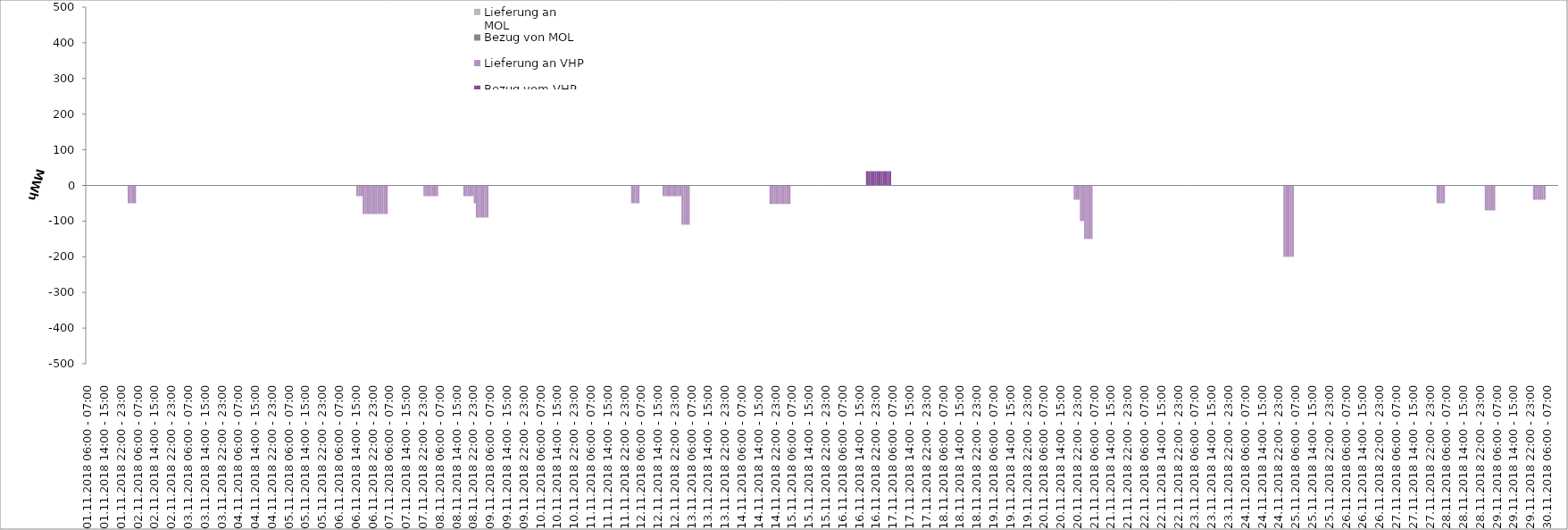
| Category | Bezug vom VHP | Lieferung an VHP | Bezug von MOL | Lieferung an MOL |
|---|---|---|---|---|
| 01.11.2018 06:00 - 07:00 | 0 | 0 | 0 | 0 |
| 01.11.2018 07:00 - 08:00 | 0 | 0 | 0 | 0 |
| 01.11.2018 08:00 - 09:00 | 0 | 0 | 0 | 0 |
| 01.11.2018 09:00 - 10:00 | 0 | 0 | 0 | 0 |
| 01.11.2018 10:00 - 11:00 | 0 | 0 | 0 | 0 |
| 01.11.2018 11:00 - 12:00 | 0 | 0 | 0 | 0 |
| 01.11.2018 12:00 - 13:00 | 0 | 0 | 0 | 0 |
| 01.11.2018 13:00 - 14:00 | 0 | 0 | 0 | 0 |
| 01.11.2018 14:00 - 15:00 | 0 | 0 | 0 | 0 |
| 01.11.2018 15:00 - 16:00 | 0 | 0 | 0 | 0 |
| 01.11.2018 16:00 - 17:00 | 0 | 0 | 0 | 0 |
| 01.11.2018 17:00 - 18:00 | 0 | 0 | 0 | 0 |
| 01.11.2018 18:00 - 19:00 | 0 | 0 | 0 | 0 |
| 01.11.2018 19:00 - 20:00 | 0 | 0 | 0 | 0 |
| 01.11.2018 20:00 - 21:00 | 0 | 0 | 0 | 0 |
| 01.11.2018 21:00 - 22:00 | 0 | 0 | 0 | 0 |
| 01.11.2018 22:00 - 23:00 | 0 | 0 | 0 | 0 |
| 01.11.2018 23:00 - 24:00 | 0 | 0 | 0 | 0 |
| 02.11.2018 00:00 - 01:00 | 0 | 0 | 0 | 0 |
| 02.11.2018 01:00 - 02:00 | 0 | 0 | 0 | 0 |
| 02.11.2018 02:00 - 03:00 | 0 | -50 | 0 | 0 |
| 02.11.2018 03:00 - 04:00 | 0 | -50 | 0 | 0 |
| 02.11.2018 04:00 - 05:00 | 0 | -50 | 0 | 0 |
| 02.11.2018 05:00 - 06:00 | 0 | -50 | 0 | 0 |
| 02.11.2018 06:00 - 07:00 | 0 | 0 | 0 | 0 |
| 02.11.2018 07:00 - 08:00 | 0 | 0 | 0 | 0 |
| 02.11.2018 08:00 - 09:00 | 0 | 0 | 0 | 0 |
| 02.11.2018 09:00 - 10:00 | 0 | 0 | 0 | 0 |
| 02.11.2018 10:00 - 11:00 | 0 | 0 | 0 | 0 |
| 02.11.2018 11:00 - 12:00 | 0 | 0 | 0 | 0 |
| 02.11.2018 12:00 - 13:00 | 0 | 0 | 0 | 0 |
| 02.11.2018 13:00 - 14:00 | 0 | 0 | 0 | 0 |
| 02.11.2018 14:00 - 15:00 | 0 | 0 | 0 | 0 |
| 02.11.2018 15:00 - 16:00 | 0 | 0 | 0 | 0 |
| 02.11.2018 16:00 - 17:00 | 0 | 0 | 0 | 0 |
| 02.11.2018 17:00 - 18:00 | 0 | 0 | 0 | 0 |
| 02.11.2018 18:00 - 19:00 | 0 | 0 | 0 | 0 |
| 02.11.2018 19:00 - 20:00 | 0 | 0 | 0 | 0 |
| 02.11.2018 20:00 - 21:00 | 0 | 0 | 0 | 0 |
| 02.11.2018 21:00 - 22:00 | 0 | 0 | 0 | 0 |
| 02.11.2018 22:00 - 23:00 | 0 | 0 | 0 | 0 |
| 02.11.2018 23:00 - 24:00 | 0 | 0 | 0 | 0 |
| 03.11.2018 00:00 - 01:00 | 0 | 0 | 0 | 0 |
| 03.11.2018 01:00 - 02:00 | 0 | 0 | 0 | 0 |
| 03.11.2018 02:00 - 03:00 | 0 | 0 | 0 | 0 |
| 03.11.2018 03:00 - 04:00 | 0 | 0 | 0 | 0 |
| 03.11.2018 04:00 - 05:00 | 0 | 0 | 0 | 0 |
| 03.11.2018 05:00 - 06:00 | 0 | 0 | 0 | 0 |
| 03.11.2018 06:00 - 07:00 | 0 | 0 | 0 | 0 |
| 03.11.2018 07:00 - 08:00 | 0 | 0 | 0 | 0 |
| 03.11.2018 08:00 - 09:00 | 0 | 0 | 0 | 0 |
| 03.11.2018 09:00 - 10:00 | 0 | 0 | 0 | 0 |
| 03.11.2018 10:00 - 11:00 | 0 | 0 | 0 | 0 |
| 03.11.2018 11:00 - 12:00 | 0 | 0 | 0 | 0 |
| 03.11.2018 12:00 - 13:00 | 0 | 0 | 0 | 0 |
| 03.11.2018 13:00 - 14:00 | 0 | 0 | 0 | 0 |
| 03.11.2018 14:00 - 15:00 | 0 | 0 | 0 | 0 |
| 03.11.2018 15:00 - 16:00 | 0 | 0 | 0 | 0 |
| 03.11.2018 16:00 - 17:00 | 0 | 0 | 0 | 0 |
| 03.11.2018 17:00 - 18:00 | 0 | 0 | 0 | 0 |
| 03.11.2018 18:00 - 19:00 | 0 | 0 | 0 | 0 |
| 03.11.2018 19:00 - 20:00 | 0 | 0 | 0 | 0 |
| 03.11.2018 20:00 - 21:00 | 0 | 0 | 0 | 0 |
| 03.11.2018 21:00 - 22:00 | 0 | 0 | 0 | 0 |
| 03.11.2018 22:00 - 23:00 | 0 | 0 | 0 | 0 |
| 03.11.2018 23:00 - 24:00 | 0 | 0 | 0 | 0 |
| 04.11.2018 00:00 - 01:00 | 0 | 0 | 0 | 0 |
| 04.11.2018 01:00 - 02:00 | 0 | 0 | 0 | 0 |
| 04.11.2018 02:00 - 03:00 | 0 | 0 | 0 | 0 |
| 04.11.2018 03:00 - 04:00 | 0 | 0 | 0 | 0 |
| 04.11.2018 04:00 - 05:00 | 0 | 0 | 0 | 0 |
| 04.11.2018 05:00 - 06:00 | 0 | 0 | 0 | 0 |
| 04.11.2018 06:00 - 07:00 | 0 | 0 | 0 | 0 |
| 04.11.2018 07:00 - 08:00 | 0 | 0 | 0 | 0 |
| 04.11.2018 08:00 - 09:00 | 0 | 0 | 0 | 0 |
| 04.11.2018 09:00 - 10:00 | 0 | 0 | 0 | 0 |
| 04.11.2018 10:00 - 11:00 | 0 | 0 | 0 | 0 |
| 04.11.2018 11:00 - 12:00 | 0 | 0 | 0 | 0 |
| 04.11.2018 12:00 - 13:00 | 0 | 0 | 0 | 0 |
| 04.11.2018 13:00 - 14:00 | 0 | 0 | 0 | 0 |
| 04.11.2018 14:00 - 15:00 | 0 | 0 | 0 | 0 |
| 04.11.2018 15:00 - 16:00 | 0 | 0 | 0 | 0 |
| 04.11.2018 16:00 - 17:00 | 0 | 0 | 0 | 0 |
| 04.11.2018 17:00 - 18:00 | 0 | 0 | 0 | 0 |
| 04.11.2018 18:00 - 19:00 | 0 | 0 | 0 | 0 |
| 04.11.2018 19:00 - 20:00 | 0 | 0 | 0 | 0 |
| 04.11.2018 20:00 - 21:00 | 0 | 0 | 0 | 0 |
| 04.11.2018 21:00 - 22:00 | 0 | 0 | 0 | 0 |
| 04.11.2018 22:00 - 23:00 | 0 | 0 | 0 | 0 |
| 04.11.2018 23:00 - 24:00 | 0 | 0 | 0 | 0 |
| 05.11.2018 00:00 - 01:00 | 0 | 0 | 0 | 0 |
| 05.11.2018 01:00 - 02:00 | 0 | 0 | 0 | 0 |
| 05.11.2018 02:00 - 03:00 | 0 | 0 | 0 | 0 |
| 05.11.2018 03:00 - 04:00 | 0 | 0 | 0 | 0 |
| 05.11.2018 04:00 - 05:00 | 0 | 0 | 0 | 0 |
| 05.11.2018 05:00 - 06:00 | 0 | 0 | 0 | 0 |
| 05.11.2018 06:00 - 07:00 | 0 | 0 | 0 | 0 |
| 05.11.2018 07:00 - 08:00 | 0 | 0 | 0 | 0 |
| 05.11.2018 08:00 - 09:00 | 0 | 0 | 0 | 0 |
| 05.11.2018 09:00 - 10:00 | 0 | 0 | 0 | 0 |
| 05.11.2018 10:00 - 11:00 | 0 | 0 | 0 | 0 |
| 05.11.2018 11:00 - 12:00 | 0 | 0 | 0 | 0 |
| 05.11.2018 12:00 - 13:00 | 0 | 0 | 0 | 0 |
| 05.11.2018 13:00 - 14:00 | 0 | 0 | 0 | 0 |
| 05.11.2018 14:00 - 15:00 | 0 | 0 | 0 | 0 |
| 05.11.2018 15:00 - 16:00 | 0 | 0 | 0 | 0 |
| 05.11.2018 16:00 - 17:00 | 0 | 0 | 0 | 0 |
| 05.11.2018 17:00 - 18:00 | 0 | 0 | 0 | 0 |
| 05.11.2018 18:00 - 19:00 | 0 | 0 | 0 | 0 |
| 05.11.2018 19:00 - 20:00 | 0 | 0 | 0 | 0 |
| 05.11.2018 20:00 - 21:00 | 0 | 0 | 0 | 0 |
| 05.11.2018 21:00 - 22:00 | 0 | 0 | 0 | 0 |
| 05.11.2018 22:00 - 23:00 | 0 | 0 | 0 | 0 |
| 05.11.2018 23:00 - 24:00 | 0 | 0 | 0 | 0 |
| 06.11.2018 00:00 - 01:00 | 0 | 0 | 0 | 0 |
| 06.11.2018 01:00 - 02:00 | 0 | 0 | 0 | 0 |
| 06.11.2018 02:00 - 03:00 | 0 | 0 | 0 | 0 |
| 06.11.2018 03:00 - 04:00 | 0 | 0 | 0 | 0 |
| 06.11.2018 04:00 - 05:00 | 0 | 0 | 0 | 0 |
| 06.11.2018 05:00 - 06:00 | 0 | 0 | 0 | 0 |
| 06.11.2018 06:00 - 07:00 | 0 | 0 | 0 | 0 |
| 06.11.2018 07:00 - 08:00 | 0 | 0 | 0 | 0 |
| 06.11.2018 08:00 - 09:00 | 0 | 0 | 0 | 0 |
| 06.11.2018 09:00 - 10:00 | 0 | 0 | 0 | 0 |
| 06.11.2018 10:00 - 11:00 | 0 | 0 | 0 | 0 |
| 06.11.2018 11:00 - 12:00 | 0 | 0 | 0 | 0 |
| 06.11.2018 12:00 - 13:00 | 0 | 0 | 0 | 0 |
| 06.11.2018 13:00 - 14:00 | 0 | 0 | 0 | 0 |
| 06.11.2018 14:00 - 15:00 | 0 | 0 | 0 | 0 |
| 06.11.2018 15:00 - 16:00 | 0 | -30 | 0 | 0 |
| 06.11.2018 16:00 - 17:00 | 0 | -30 | 0 | 0 |
| 06.11.2018 17:00 - 18:00 | 0 | -30 | 0 | 0 |
| 06.11.2018 18:00 - 19:00 | 0 | -80 | 0 | 0 |
| 06.11.2018 19:00 - 20:00 | 0 | -80 | 0 | 0 |
| 06.11.2018 20:00 - 21:00 | 0 | -80 | 0 | 0 |
| 06.11.2018 21:00 - 22:00 | 0 | -80 | 0 | 0 |
| 06.11.2018 22:00 - 23:00 | 0 | -80 | 0 | 0 |
| 06.11.2018 23:00 - 24:00 | 0 | -80 | 0 | 0 |
| 07.11.2018 00:00 - 01:00 | 0 | -80 | 0 | 0 |
| 07.11.2018 01:00 - 02:00 | 0 | -80 | 0 | 0 |
| 07.11.2018 02:00 - 03:00 | 0 | -80 | 0 | 0 |
| 07.11.2018 03:00 - 04:00 | 0 | -80 | 0 | 0 |
| 07.11.2018 04:00 - 05:00 | 0 | -80 | 0 | 0 |
| 07.11.2018 05:00 - 06:00 | 0 | -80 | 0 | 0 |
| 07.11.2018 06:00 - 07:00 | 0 | 0 | 0 | 0 |
| 07.11.2018 07:00 - 08:00 | 0 | 0 | 0 | 0 |
| 07.11.2018 08:00 - 09:00 | 0 | 0 | 0 | 0 |
| 07.11.2018 09:00 - 10:00 | 0 | 0 | 0 | 0 |
| 07.11.2018 10:00 - 11:00 | 0 | 0 | 0 | 0 |
| 07.11.2018 11:00 - 12:00 | 0 | 0 | 0 | 0 |
| 07.11.2018 12:00 - 13:00 | 0 | 0 | 0 | 0 |
| 07.11.2018 13:00 - 14:00 | 0 | 0 | 0 | 0 |
| 07.11.2018 14:00 - 15:00 | 0 | 0 | 0 | 0 |
| 07.11.2018 15:00 - 16:00 | 0 | 0 | 0 | 0 |
| 07.11.2018 16:00 - 17:00 | 0 | 0 | 0 | 0 |
| 07.11.2018 17:00 - 18:00 | 0 | 0 | 0 | 0 |
| 07.11.2018 18:00 - 19:00 | 0 | 0 | 0 | 0 |
| 07.11.2018 19:00 - 20:00 | 0 | 0 | 0 | 0 |
| 07.11.2018 20:00 - 21:00 | 0 | 0 | 0 | 0 |
| 07.11.2018 21:00 - 22:00 | 0 | 0 | 0 | 0 |
| 07.11.2018 22:00 - 23:00 | 0 | 0 | 0 | 0 |
| 07.11.2018 23:00 - 24:00 | 0 | -30 | 0 | 0 |
| 08.11.2018 00:00 - 01:00 | 0 | -30 | 0 | 0 |
| 08.11.2018 01:00 - 02:00 | 0 | -30 | 0 | 0 |
| 08.11.2018 02:00 - 03:00 | 0 | -30 | 0 | 0 |
| 08.11.2018 03:00 - 04:00 | 0 | -30 | 0 | 0 |
| 08.11.2018 04:00 - 05:00 | 0 | -30 | 0 | 0 |
| 08.11.2018 05:00 - 06:00 | 0 | -30 | 0 | 0 |
| 08.11.2018 06:00 - 07:00 | 0 | 0 | 0 | 0 |
| 08.11.2018 07:00 - 08:00 | 0 | 0 | 0 | 0 |
| 08.11.2018 08:00 - 09:00 | 0 | 0 | 0 | 0 |
| 08.11.2018 09:00 - 10:00 | 0 | 0 | 0 | 0 |
| 08.11.2018 10:00 - 11:00 | 0 | 0 | 0 | 0 |
| 08.11.2018 11:00 - 12:00 | 0 | 0 | 0 | 0 |
| 08.11.2018 12:00 - 13:00 | 0 | 0 | 0 | 0 |
| 08.11.2018 13:00 - 14:00 | 0 | 0 | 0 | 0 |
| 08.11.2018 14:00 - 15:00 | 0 | 0 | 0 | 0 |
| 08.11.2018 15:00 - 16:00 | 0 | 0 | 0 | 0 |
| 08.11.2018 16:00 - 17:00 | 0 | 0 | 0 | 0 |
| 08.11.2018 17:00 - 18:00 | 0 | 0 | 0 | 0 |
| 08.11.2018 18:00 - 19:00 | 0 | -30 | 0 | 0 |
| 08.11.2018 19:00 - 20:00 | 0 | -30 | 0 | 0 |
| 08.11.2018 20:00 - 21:00 | 0 | -30 | 0 | 0 |
| 08.11.2018 21:00 - 22:00 | 0 | -30 | 0 | 0 |
| 08.11.2018 22:00 - 23:00 | 0 | -30 | 0 | 0 |
| 08.11.2018 23:00 - 24:00 | 0 | -50 | 0 | 0 |
| 09.11.2018 00:00 - 01:00 | 0 | -90 | 0 | 0 |
| 09.11.2018 01:00 - 02:00 | 0 | -90 | 0 | 0 |
| 09.11.2018 02:00 - 03:00 | 0 | -90 | 0 | 0 |
| 09.11.2018 03:00 - 04:00 | 0 | -90 | 0 | 0 |
| 09.11.2018 04:00 - 05:00 | 0 | -90 | 0 | 0 |
| 09.11.2018 05:00 - 06:00 | 0 | -90 | 0 | 0 |
| 09.11.2018 06:00 - 07:00 | 0 | 0 | 0 | 0 |
| 09.11.2018 07:00 - 08:00 | 0 | 0 | 0 | 0 |
| 09.11.2018 08:00 - 09:00 | 0 | 0 | 0 | 0 |
| 09.11.2018 09:00 - 10:00 | 0 | 0 | 0 | 0 |
| 09.11.2018 10:00 - 11:00 | 0 | 0 | 0 | 0 |
| 09.11.2018 11:00 - 12:00 | 0 | 0 | 0 | 0 |
| 09.11.2018 12:00 - 13:00 | 0 | 0 | 0 | 0 |
| 09.11.2018 13:00 - 14:00 | 0 | 0 | 0 | 0 |
| 09.11.2018 14:00 - 15:00 | 0 | 0 | 0 | 0 |
| 09.11.2018 15:00 - 16:00 | 0 | 0 | 0 | 0 |
| 09.11.2018 16:00 - 17:00 | 0 | 0 | 0 | 0 |
| 09.11.2018 17:00 - 18:00 | 0 | 0 | 0 | 0 |
| 09.11.2018 18:00 - 19:00 | 0 | 0 | 0 | 0 |
| 09.11.2018 19:00 - 20:00 | 0 | 0 | 0 | 0 |
| 09.11.2018 20:00 - 21:00 | 0 | 0 | 0 | 0 |
| 09.11.2018 21:00 - 22:00 | 0 | 0 | 0 | 0 |
| 09.11.2018 22:00 - 23:00 | 0 | 0 | 0 | 0 |
| 09.11.2018 23:00 - 24:00 | 0 | 0 | 0 | 0 |
| 10.11.2018 00:00 - 01:00 | 0 | 0 | 0 | 0 |
| 10.11.2018 01:00 - 02:00 | 0 | 0 | 0 | 0 |
| 10.11.2018 02:00 - 03:00 | 0 | 0 | 0 | 0 |
| 10.11.2018 03:00 - 04:00 | 0 | 0 | 0 | 0 |
| 10.11.2018 04:00 - 05:00 | 0 | 0 | 0 | 0 |
| 10.11.2018 05:00 - 06:00 | 0 | 0 | 0 | 0 |
| 10.11.2018 06:00 - 07:00 | 0 | 0 | 0 | 0 |
| 10.11.2018 07:00 - 08:00 | 0 | 0 | 0 | 0 |
| 10.11.2018 08:00 - 09:00 | 0 | 0 | 0 | 0 |
| 10.11.2018 09:00 - 10:00 | 0 | 0 | 0 | 0 |
| 10.11.2018 10:00 - 11:00 | 0 | 0 | 0 | 0 |
| 10.11.2018 11:00 - 12:00 | 0 | 0 | 0 | 0 |
| 10.11.2018 12:00 - 13:00 | 0 | 0 | 0 | 0 |
| 10.11.2018 13:00 - 14:00 | 0 | 0 | 0 | 0 |
| 10.11.2018 14:00 - 15:00 | 0 | 0 | 0 | 0 |
| 10.11.2018 15:00 - 16:00 | 0 | 0 | 0 | 0 |
| 10.11.2018 16:00 - 17:00 | 0 | 0 | 0 | 0 |
| 10.11.2018 17:00 - 18:00 | 0 | 0 | 0 | 0 |
| 10.11.2018 18:00 - 19:00 | 0 | 0 | 0 | 0 |
| 10.11.2018 19:00 - 20:00 | 0 | 0 | 0 | 0 |
| 10.11.2018 20:00 - 21:00 | 0 | 0 | 0 | 0 |
| 10.11.2018 21:00 - 22:00 | 0 | 0 | 0 | 0 |
| 10.11.2018 22:00 - 23:00 | 0 | 0 | 0 | 0 |
| 10.11.2018 23:00 - 24:00 | 0 | 0 | 0 | 0 |
| 11.11.2018 00:00 - 01:00 | 0 | 0 | 0 | 0 |
| 11.11.2018 01:00 - 02:00 | 0 | 0 | 0 | 0 |
| 11.11.2018 02:00 - 03:00 | 0 | 0 | 0 | 0 |
| 11.11.2018 03:00 - 04:00 | 0 | 0 | 0 | 0 |
| 11.11.2018 04:00 - 05:00 | 0 | 0 | 0 | 0 |
| 11.11.2018 05:00 - 06:00 | 0 | 0 | 0 | 0 |
| 11.11.2018 06:00 - 07:00 | 0 | 0 | 0 | 0 |
| 11.11.2018 07:00 - 08:00 | 0 | 0 | 0 | 0 |
| 11.11.2018 08:00 - 09:00 | 0 | 0 | 0 | 0 |
| 11.11.2018 09:00 - 10:00 | 0 | 0 | 0 | 0 |
| 11.11.2018 10:00 - 11:00 | 0 | 0 | 0 | 0 |
| 11.11.2018 11:00 - 12:00 | 0 | 0 | 0 | 0 |
| 11.11.2018 12:00 - 13:00 | 0 | 0 | 0 | 0 |
| 11.11.2018 13:00 - 14:00 | 0 | 0 | 0 | 0 |
| 11.11.2018 14:00 - 15:00 | 0 | 0 | 0 | 0 |
| 11.11.2018 15:00 - 16:00 | 0 | 0 | 0 | 0 |
| 11.11.2018 16:00 - 17:00 | 0 | 0 | 0 | 0 |
| 11.11.2018 17:00 - 18:00 | 0 | 0 | 0 | 0 |
| 11.11.2018 18:00 - 19:00 | 0 | 0 | 0 | 0 |
| 11.11.2018 19:00 - 20:00 | 0 | 0 | 0 | 0 |
| 11.11.2018 20:00 - 21:00 | 0 | 0 | 0 | 0 |
| 11.11.2018 21:00 - 22:00 | 0 | 0 | 0 | 0 |
| 11.11.2018 22:00 - 23:00 | 0 | 0 | 0 | 0 |
| 11.11.2018 23:00 - 24:00 | 0 | 0 | 0 | 0 |
| 12.11.2018 00:00 - 01:00 | 0 | 0 | 0 | 0 |
| 12.11.2018 01:00 - 02:00 | 0 | 0 | 0 | 0 |
| 12.11.2018 02:00 - 03:00 | 0 | -50 | 0 | 0 |
| 12.11.2018 03:00 - 04:00 | 0 | -50 | 0 | 0 |
| 12.11.2018 04:00 - 05:00 | 0 | -50 | 0 | 0 |
| 12.11.2018 05:00 - 06:00 | 0 | -50 | 0 | 0 |
| 12.11.2018 06:00 - 07:00 | 0 | 0 | 0 | 0 |
| 12.11.2018 07:00 - 08:00 | 0 | 0 | 0 | 0 |
| 12.11.2018 08:00 - 09:00 | 0 | 0 | 0 | 0 |
| 12.11.2018 09:00 - 10:00 | 0 | 0 | 0 | 0 |
| 12.11.2018 10:00 - 11:00 | 0 | 0 | 0 | 0 |
| 12.11.2018 11:00 - 12:00 | 0 | 0 | 0 | 0 |
| 12.11.2018 12:00 - 13:00 | 0 | 0 | 0 | 0 |
| 12.11.2018 13:00 - 14:00 | 0 | 0 | 0 | 0 |
| 12.11.2018 14:00 - 15:00 | 0 | 0 | 0 | 0 |
| 12.11.2018 15:00 - 16:00 | 0 | 0 | 0 | 0 |
| 12.11.2018 16:00 - 17:00 | 0 | 0 | 0 | 0 |
| 12.11.2018 17:00 - 18:00 | 0 | -30 | 0 | 0 |
| 12.11.2018 18:00 - 19:00 | 0 | -30 | 0 | 0 |
| 12.11.2018 19:00 - 20:00 | 0 | -30 | 0 | 0 |
| 12.11.2018 20:00 - 21:00 | 0 | -30 | 0 | 0 |
| 12.11.2018 21:00 - 22:00 | 0 | -30 | 0 | 0 |
| 12.11.2018 22:00 - 23:00 | 0 | -30 | 0 | 0 |
| 12.11.2018 23:00 - 24:00 | 0 | -30 | 0 | 0 |
| 13.11.2018 00:00 - 01:00 | 0 | -30 | 0 | 0 |
| 13.11.2018 01:00 - 02:00 | 0 | -30 | 0 | 0 |
| 13.11.2018 02:00 - 03:00 | 0 | -110 | 0 | 0 |
| 13.11.2018 03:00 - 04:00 | 0 | -110 | 0 | 0 |
| 13.11.2018 04:00 - 05:00 | 0 | -110 | 0 | 0 |
| 13.11.2018 05:00 - 06:00 | 0 | -110 | 0 | 0 |
| 13.11.2018 06:00 - 07:00 | 0 | 0 | 0 | 0 |
| 13.11.2018 07:00 - 08:00 | 0 | 0 | 0 | 0 |
| 13.11.2018 08:00 - 09:00 | 0 | 0 | 0 | 0 |
| 13.11.2018 09:00 - 10:00 | 0 | 0 | 0 | 0 |
| 13.11.2018 10:00 - 11:00 | 0 | 0 | 0 | 0 |
| 13.11.2018 11:00 - 12:00 | 0 | 0 | 0 | 0 |
| 13.11.2018 12:00 - 13:00 | 0 | 0 | 0 | 0 |
| 13.11.2018 13:00 - 14:00 | 0 | 0 | 0 | 0 |
| 13.11.2018 14:00 - 15:00 | 0 | 0 | 0 | 0 |
| 13.11.2018 15:00 - 16:00 | 0 | 0 | 0 | 0 |
| 13.11.2018 16:00 - 17:00 | 0 | 0 | 0 | 0 |
| 13.11.2018 17:00 - 18:00 | 0 | 0 | 0 | 0 |
| 13.11.2018 18:00 - 19:00 | 0 | 0 | 0 | 0 |
| 13.11.2018 19:00 - 20:00 | 0 | 0 | 0 | 0 |
| 13.11.2018 20:00 - 21:00 | 0 | 0 | 0 | 0 |
| 13.11.2018 21:00 - 22:00 | 0 | 0 | 0 | 0 |
| 13.11.2018 22:00 - 23:00 | 0 | 0 | 0 | 0 |
| 13.11.2018 23:00 - 24:00 | 0 | 0 | 0 | 0 |
| 14.11.2018 00:00 - 01:00 | 0 | 0 | 0 | 0 |
| 14.11.2018 01:00 - 02:00 | 0 | 0 | 0 | 0 |
| 14.11.2018 02:00 - 03:00 | 0 | 0 | 0 | 0 |
| 14.11.2018 03:00 - 04:00 | 0 | 0 | 0 | 0 |
| 14.11.2018 04:00 - 05:00 | 0 | 0 | 0 | 0 |
| 14.11.2018 05:00 - 06:00 | 0 | 0 | 0 | 0 |
| 14.11.2018 06:00 - 07:00 | 0 | 0 | 0 | 0 |
| 14.11.2018 07:00 - 08:00 | 0 | 0 | 0 | 0 |
| 14.11.2018 08:00 - 09:00 | 0 | 0 | 0 | 0 |
| 14.11.2018 09:00 - 10:00 | 0 | 0 | 0 | 0 |
| 14.11.2018 10:00 - 11:00 | 0 | 0 | 0 | 0 |
| 14.11.2018 11:00 - 12:00 | 0 | 0 | 0 | 0 |
| 14.11.2018 12:00 - 13:00 | 0 | 0 | 0 | 0 |
| 14.11.2018 13:00 - 14:00 | 0 | 0 | 0 | 0 |
| 14.11.2018 14:00 - 15:00 | 0 | 0 | 0 | 0 |
| 14.11.2018 15:00 - 16:00 | 0 | 0 | 0 | 0 |
| 14.11.2018 16:00 - 17:00 | 0 | 0 | 0 | 0 |
| 14.11.2018 17:00 - 18:00 | 0 | 0 | 0 | 0 |
| 14.11.2018 18:00 - 19:00 | 0 | 0 | 0 | 0 |
| 14.11.2018 19:00 - 20:00 | 0 | 0 | 0 | 0 |
| 14.11.2018 20:00 - 21:00 | 0 | -52 | 0 | 0 |
| 14.11.2018 21:00 - 22:00 | 0 | -52 | 0 | 0 |
| 14.11.2018 22:00 - 23:00 | 0 | -52 | 0 | 0 |
| 14.11.2018 23:00 - 24:00 | 0 | -52 | 0 | 0 |
| 15.11.2018 00:00 - 01:00 | 0 | -52 | 0 | 0 |
| 15.11.2018 01:00 - 02:00 | 0 | -52 | 0 | 0 |
| 15.11.2018 02:00 - 03:00 | 0 | -52 | 0 | 0 |
| 15.11.2018 03:00 - 04:00 | 0 | -52 | 0 | 0 |
| 15.11.2018 04:00 - 05:00 | 0 | -52 | 0 | 0 |
| 15.11.2018 05:00 - 06:00 | 0 | -52 | 0 | 0 |
| 15.11.2018 06:00 - 07:00 | 0 | 0 | 0 | 0 |
| 15.11.2018 07:00 - 08:00 | 0 | 0 | 0 | 0 |
| 15.11.2018 08:00 - 09:00 | 0 | 0 | 0 | 0 |
| 15.11.2018 09:00 - 10:00 | 0 | 0 | 0 | 0 |
| 15.11.2018 10:00 - 11:00 | 0 | 0 | 0 | 0 |
| 15.11.2018 11:00 - 12:00 | 0 | 0 | 0 | 0 |
| 15.11.2018 12:00 - 13:00 | 0 | 0 | 0 | 0 |
| 15.11.2018 13:00 - 14:00 | 0 | 0 | 0 | 0 |
| 15.11.2018 14:00 - 15:00 | 0 | 0 | 0 | 0 |
| 15.11.2018 15:00 - 16:00 | 0 | 0 | 0 | 0 |
| 15.11.2018 16:00 - 17:00 | 0 | 0 | 0 | 0 |
| 15.11.2018 17:00 - 18:00 | 0 | 0 | 0 | 0 |
| 15.11.2018 18:00 - 19:00 | 0 | 0 | 0 | 0 |
| 15.11.2018 19:00 - 20:00 | 0 | 0 | 0 | 0 |
| 15.11.2018 20:00 - 21:00 | 0 | 0 | 0 | 0 |
| 15.11.2018 21:00 - 22:00 | 0 | 0 | 0 | 0 |
| 15.11.2018 22:00 - 23:00 | 0 | 0 | 0 | 0 |
| 15.11.2018 23:00 - 24:00 | 0 | 0 | 0 | 0 |
| 16.11.2018 00:00 - 01:00 | 0 | 0 | 0 | 0 |
| 16.11.2018 01:00 - 02:00 | 0 | 0 | 0 | 0 |
| 16.11.2018 02:00 - 03:00 | 0 | 0 | 0 | 0 |
| 16.11.2018 03:00 - 04:00 | 0 | 0 | 0 | 0 |
| 16.11.2018 04:00 - 05:00 | 0 | 0 | 0 | 0 |
| 16.11.2018 05:00 - 06:00 | 0 | 0 | 0 | 0 |
| 16.11.2018 06:00 - 07:00 | 0 | 0 | 0 | 0 |
| 16.11.2018 07:00 - 08:00 | 0 | 0 | 0 | 0 |
| 16.11.2018 08:00 - 09:00 | 0 | 0 | 0 | 0 |
| 16.11.2018 09:00 - 10:00 | 0 | 0 | 0 | 0 |
| 16.11.2018 10:00 - 11:00 | 0 | 0 | 0 | 0 |
| 16.11.2018 11:00 - 12:00 | 0 | 0 | 0 | 0 |
| 16.11.2018 12:00 - 13:00 | 0 | 0 | 0 | 0 |
| 16.11.2018 13:00 - 14:00 | 0 | 0 | 0 | 0 |
| 16.11.2018 14:00 - 15:00 | 0 | 0 | 0 | 0 |
| 16.11.2018 15:00 - 16:00 | 0 | 0 | 0 | 0 |
| 16.11.2018 16:00 - 17:00 | 0 | 0 | 0 | 0 |
| 16.11.2018 17:00 - 18:00 | 0 | 0 | 0 | 0 |
| 16.11.2018 18:00 - 19:00 | 40 | 0 | 0 | 0 |
| 16.11.2018 19:00 - 20:00 | 40 | 0 | 0 | 0 |
| 16.11.2018 20:00 - 21:00 | 40 | 0 | 0 | 0 |
| 16.11.2018 21:00 - 22:00 | 40 | 0 | 0 | 0 |
| 16.11.2018 22:00 - 23:00 | 40 | 0 | 0 | 0 |
| 16.11.2018 23:00 - 24:00 | 40 | 0 | 0 | 0 |
| 17.11.2018 00:00 - 01:00 | 40 | 0 | 0 | 0 |
| 17.11.2018 01:00 - 02:00 | 40 | 0 | 0 | 0 |
| 17.11.2018 02:00 - 03:00 | 40 | 0 | 0 | 0 |
| 17.11.2018 03:00 - 04:00 | 40 | 0 | 0 | 0 |
| 17.11.2018 04:00 - 05:00 | 40 | 0 | 0 | 0 |
| 17.11.2018 05:00 - 06:00 | 40 | 0 | 0 | 0 |
| 17.11.2018 06:00 - 07:00 | 0 | 0 | 0 | 0 |
| 17.11.2018 07:00 - 08:00 | 0 | 0 | 0 | 0 |
| 17.11.2018 08:00 - 09:00 | 0 | 0 | 0 | 0 |
| 17.11.2018 09:00 - 10:00 | 0 | 0 | 0 | 0 |
| 17.11.2018 10:00 - 11:00 | 0 | 0 | 0 | 0 |
| 17.11.2018 11:00 - 12:00 | 0 | 0 | 0 | 0 |
| 17.11.2018 12:00 - 13:00 | 0 | 0 | 0 | 0 |
| 17.11.2018 13:00 - 14:00 | 0 | 0 | 0 | 0 |
| 17.11.2018 14:00 - 15:00 | 0 | 0 | 0 | 0 |
| 17.11.2018 15:00 - 16:00 | 0 | 0 | 0 | 0 |
| 17.11.2018 16:00 - 17:00 | 0 | 0 | 0 | 0 |
| 17.11.2018 17:00 - 18:00 | 0 | 0 | 0 | 0 |
| 17.11.2018 18:00 - 19:00 | 0 | 0 | 0 | 0 |
| 17.11.2018 19:00 - 20:00 | 0 | 0 | 0 | 0 |
| 17.11.2018 20:00 - 21:00 | 0 | 0 | 0 | 0 |
| 17.11.2018 21:00 - 22:00 | 0 | 0 | 0 | 0 |
| 17.11.2018 22:00 - 23:00 | 0 | 0 | 0 | 0 |
| 17.11.2018 23:00 - 24:00 | 0 | 0 | 0 | 0 |
| 18.11.2018 00:00 - 01:00 | 0 | 0 | 0 | 0 |
| 18.11.2018 01:00 - 02:00 | 0 | 0 | 0 | 0 |
| 18.11.2018 02:00 - 03:00 | 0 | 0 | 0 | 0 |
| 18.11.2018 03:00 - 04:00 | 0 | 0 | 0 | 0 |
| 18.11.2018 04:00 - 05:00 | 0 | 0 | 0 | 0 |
| 18.11.2018 05:00 - 06:00 | 0 | 0 | 0 | 0 |
| 18.11.2018 06:00 - 07:00 | 0 | 0 | 0 | 0 |
| 18.11.2018 07:00 - 08:00 | 0 | 0 | 0 | 0 |
| 18.11.2018 08:00 - 09:00 | 0 | 0 | 0 | 0 |
| 18.11.2018 09:00 - 10:00 | 0 | 0 | 0 | 0 |
| 18.11.2018 10:00 - 11:00 | 0 | 0 | 0 | 0 |
| 18.11.2018 11:00 - 12:00 | 0 | 0 | 0 | 0 |
| 18.11.2018 12:00 - 13:00 | 0 | 0 | 0 | 0 |
| 18.11.2018 13:00 - 14:00 | 0 | 0 | 0 | 0 |
| 18.11.2018 14:00 - 15:00 | 0 | 0 | 0 | 0 |
| 18.11.2018 15:00 - 16:00 | 0 | 0 | 0 | 0 |
| 18.11.2018 16:00 - 17:00 | 0 | 0 | 0 | 0 |
| 18.11.2018 17:00 - 18:00 | 0 | 0 | 0 | 0 |
| 18.11.2018 18:00 - 19:00 | 0 | 0 | 0 | 0 |
| 18.11.2018 19:00 - 20:00 | 0 | 0 | 0 | 0 |
| 18.11.2018 20:00 - 21:00 | 0 | 0 | 0 | 0 |
| 18.11.2018 21:00 - 22:00 | 0 | 0 | 0 | 0 |
| 18.11.2018 22:00 - 23:00 | 0 | 0 | 0 | 0 |
| 18.11.2018 23:00 - 24:00 | 0 | 0 | 0 | 0 |
| 19.11.2018 00:00 - 01:00 | 0 | 0 | 0 | 0 |
| 19.11.2018 01:00 - 02:00 | 0 | 0 | 0 | 0 |
| 19.11.2018 02:00 - 03:00 | 0 | 0 | 0 | 0 |
| 19.11.2018 03:00 - 04:00 | 0 | 0 | 0 | 0 |
| 19.11.2018 04:00 - 05:00 | 0 | 0 | 0 | 0 |
| 19.11.2018 05:00 - 06:00 | 0 | 0 | 0 | 0 |
| 19.11.2018 06:00 - 07:00 | 0 | 0 | 0 | 0 |
| 19.11.2018 07:00 - 08:00 | 0 | 0 | 0 | 0 |
| 19.11.2018 08:00 - 09:00 | 0 | 0 | 0 | 0 |
| 19.11.2018 09:00 - 10:00 | 0 | 0 | 0 | 0 |
| 19.11.2018 10:00 - 11:00 | 0 | 0 | 0 | 0 |
| 19.11.2018 11:00 - 12:00 | 0 | 0 | 0 | 0 |
| 19.11.2018 12:00 - 13:00 | 0 | 0 | 0 | 0 |
| 19.11.2018 13:00 - 14:00 | 0 | 0 | 0 | 0 |
| 19.11.2018 14:00 - 15:00 | 0 | 0 | 0 | 0 |
| 19.11.2018 15:00 - 16:00 | 0 | 0 | 0 | 0 |
| 19.11.2018 16:00 - 17:00 | 0 | 0 | 0 | 0 |
| 19.11.2018 17:00 - 18:00 | 0 | 0 | 0 | 0 |
| 19.11.2018 18:00 - 19:00 | 0 | 0 | 0 | 0 |
| 19.11.2018 19:00 - 20:00 | 0 | 0 | 0 | 0 |
| 19.11.2018 20:00 - 21:00 | 0 | 0 | 0 | 0 |
| 19.11.2018 21:00 - 22:00 | 0 | 0 | 0 | 0 |
| 19.11.2018 22:00 - 23:00 | 0 | 0 | 0 | 0 |
| 19.11.2018 23:00 - 24:00 | 0 | 0 | 0 | 0 |
| 20.11.2018 00:00 - 01:00 | 0 | 0 | 0 | 0 |
| 20.11.2018 01:00 - 02:00 | 0 | 0 | 0 | 0 |
| 20.11.2018 02:00 - 03:00 | 0 | 0 | 0 | 0 |
| 20.11.2018 03:00 - 04:00 | 0 | 0 | 0 | 0 |
| 20.11.2018 04:00 - 05:00 | 0 | 0 | 0 | 0 |
| 20.11.2018 05:00 - 06:00 | 0 | 0 | 0 | 0 |
| 20.11.2018 06:00 - 07:00 | 0 | 0 | 0 | 0 |
| 20.11.2018 07:00 - 08:00 | 0 | 0 | 0 | 0 |
| 20.11.2018 08:00 - 09:00 | 0 | 0 | 0 | 0 |
| 20.11.2018 09:00 - 10:00 | 0 | 0 | 0 | 0 |
| 20.11.2018 10:00 - 11:00 | 0 | 0 | 0 | 0 |
| 20.11.2018 11:00 - 12:00 | 0 | 0 | 0 | 0 |
| 20.11.2018 12:00 - 13:00 | 0 | 0 | 0 | 0 |
| 20.11.2018 13:00 - 14:00 | 0 | 0 | 0 | 0 |
| 20.11.2018 14:00 - 15:00 | 0 | 0 | 0 | 0 |
| 20.11.2018 15:00 - 16:00 | 0 | 0 | 0 | 0 |
| 20.11.2018 16:00 - 17:00 | 0 | 0 | 0 | 0 |
| 20.11.2018 17:00 - 18:00 | 0 | 0 | 0 | 0 |
| 20.11.2018 18:00 - 19:00 | 0 | 0 | 0 | 0 |
| 20.11.2018 19:00 - 20:00 | 0 | 0 | 0 | 0 |
| 20.11.2018 20:00 - 21:00 | 0 | 0 | 0 | 0 |
| 20.11.2018 21:00 - 22:00 | 0 | -40 | 0 | 0 |
| 20.11.2018 22:00 - 23:00 | 0 | -40 | 0 | 0 |
| 20.11.2018 23:00 - 24:00 | 0 | -40 | 0 | 0 |
| 21.11.2018 00:00 - 01:00 | 0 | -100 | 0 | 0 |
| 21.11.2018 01:00 - 02:00 | 0 | -100 | 0 | 0 |
| 21.11.2018 02:00 - 03:00 | 0 | -150 | 0 | 0 |
| 21.11.2018 03:00 - 04:00 | 0 | -150 | 0 | 0 |
| 21.11.2018 04:00 - 05:00 | 0 | -150 | 0 | 0 |
| 21.11.2018 05:00 - 06:00 | 0 | -150 | 0 | 0 |
| 21.11.2018 06:00 - 07:00 | 0 | 0 | 0 | 0 |
| 21.11.2018 07:00 - 08:00 | 0 | 0 | 0 | 0 |
| 21.11.2018 08:00 - 09:00 | 0 | 0 | 0 | 0 |
| 21.11.2018 09:00 - 10:00 | 0 | 0 | 0 | 0 |
| 21.11.2018 10:00 - 11:00 | 0 | 0 | 0 | 0 |
| 21.11.2018 11:00 - 12:00 | 0 | 0 | 0 | 0 |
| 21.11.2018 12:00 - 13:00 | 0 | 0 | 0 | 0 |
| 21.11.2018 13:00 - 14:00 | 0 | 0 | 0 | 0 |
| 21.11.2018 14:00 - 15:00 | 0 | 0 | 0 | 0 |
| 21.11.2018 15:00 - 16:00 | 0 | 0 | 0 | 0 |
| 21.11.2018 16:00 - 17:00 | 0 | 0 | 0 | 0 |
| 21.11.2018 17:00 - 18:00 | 0 | 0 | 0 | 0 |
| 21.11.2018 18:00 - 19:00 | 0 | 0 | 0 | 0 |
| 21.11.2018 19:00 - 20:00 | 0 | 0 | 0 | 0 |
| 21.11.2018 20:00 - 21:00 | 0 | 0 | 0 | 0 |
| 21.11.2018 21:00 - 22:00 | 0 | 0 | 0 | 0 |
| 21.11.2018 22:00 - 23:00 | 0 | 0 | 0 | 0 |
| 21.11.2018 23:00 - 24:00 | 0 | 0 | 0 | 0 |
| 22.11.2018 00:00 - 01:00 | 0 | 0 | 0 | 0 |
| 22.11.2018 01:00 - 02:00 | 0 | 0 | 0 | 0 |
| 22.11.2018 02:00 - 03:00 | 0 | 0 | 0 | 0 |
| 22.11.2018 03:00 - 04:00 | 0 | 0 | 0 | 0 |
| 22.11.2018 04:00 - 05:00 | 0 | 0 | 0 | 0 |
| 22.11.2018 05:00 - 06:00 | 0 | 0 | 0 | 0 |
| 22.11.2018 06:00 - 07:00 | 0 | 0 | 0 | 0 |
| 22.11.2018 07:00 - 08:00 | 0 | 0 | 0 | 0 |
| 22.11.2018 08:00 - 09:00 | 0 | 0 | 0 | 0 |
| 22.11.2018 09:00 - 10:00 | 0 | 0 | 0 | 0 |
| 22.11.2018 10:00 - 11:00 | 0 | 0 | 0 | 0 |
| 22.11.2018 11:00 - 12:00 | 0 | 0 | 0 | 0 |
| 22.11.2018 12:00 - 13:00 | 0 | 0 | 0 | 0 |
| 22.11.2018 13:00 - 14:00 | 0 | 0 | 0 | 0 |
| 22.11.2018 14:00 - 15:00 | 0 | 0 | 0 | 0 |
| 22.11.2018 15:00 - 16:00 | 0 | 0 | 0 | 0 |
| 22.11.2018 16:00 - 17:00 | 0 | 0 | 0 | 0 |
| 22.11.2018 17:00 - 18:00 | 0 | 0 | 0 | 0 |
| 22.11.2018 18:00 - 19:00 | 0 | 0 | 0 | 0 |
| 22.11.2018 19:00 - 20:00 | 0 | 0 | 0 | 0 |
| 22.11.2018 20:00 - 21:00 | 0 | 0 | 0 | 0 |
| 22.11.2018 21:00 - 22:00 | 0 | 0 | 0 | 0 |
| 22.11.2018 22:00 - 23:00 | 0 | 0 | 0 | 0 |
| 22.11.2018 23:00 - 24:00 | 0 | 0 | 0 | 0 |
| 23.11.2018 00:00 - 01:00 | 0 | 0 | 0 | 0 |
| 23.11.2018 01:00 - 02:00 | 0 | 0 | 0 | 0 |
| 23.11.2018 02:00 - 03:00 | 0 | 0 | 0 | 0 |
| 23.11.2018 03:00 - 04:00 | 0 | 0 | 0 | 0 |
| 23.11.2018 04:00 - 05:00 | 0 | 0 | 0 | 0 |
| 23.11.2018 05:00 - 06:00 | 0 | 0 | 0 | 0 |
| 23.11.2018 06:00 - 07:00 | 0 | 0 | 0 | 0 |
| 23.11.2018 07:00 - 08:00 | 0 | 0 | 0 | 0 |
| 23.11.2018 08:00 - 09:00 | 0 | 0 | 0 | 0 |
| 23.11.2018 09:00 - 10:00 | 0 | 0 | 0 | 0 |
| 23.11.2018 10:00 - 11:00 | 0 | 0 | 0 | 0 |
| 23.11.2018 11:00 - 12:00 | 0 | 0 | 0 | 0 |
| 23.11.2018 12:00 - 13:00 | 0 | 0 | 0 | 0 |
| 23.11.2018 13:00 - 14:00 | 0 | 0 | 0 | 0 |
| 23.11.2018 14:00 - 15:00 | 0 | 0 | 0 | 0 |
| 23.11.2018 15:00 - 16:00 | 0 | 0 | 0 | 0 |
| 23.11.2018 16:00 - 17:00 | 0 | 0 | 0 | 0 |
| 23.11.2018 17:00 - 18:00 | 0 | 0 | 0 | 0 |
| 23.11.2018 18:00 - 19:00 | 0 | 0 | 0 | 0 |
| 23.11.2018 19:00 - 20:00 | 0 | 0 | 0 | 0 |
| 23.11.2018 20:00 - 21:00 | 0 | 0 | 0 | 0 |
| 23.11.2018 21:00 - 22:00 | 0 | 0 | 0 | 0 |
| 23.11.2018 22:00 - 23:00 | 0 | 0 | 0 | 0 |
| 23.11.2018 23:00 - 24:00 | 0 | 0 | 0 | 0 |
| 24.11.2018 00:00 - 01:00 | 0 | 0 | 0 | 0 |
| 24.11.2018 01:00 - 02:00 | 0 | 0 | 0 | 0 |
| 24.11.2018 02:00 - 03:00 | 0 | 0 | 0 | 0 |
| 24.11.2018 03:00 - 04:00 | 0 | 0 | 0 | 0 |
| 24.11.2018 04:00 - 05:00 | 0 | 0 | 0 | 0 |
| 24.11.2018 05:00 - 06:00 | 0 | 0 | 0 | 0 |
| 24.11.2018 06:00 - 07:00 | 0 | 0 | 0 | 0 |
| 24.11.2018 07:00 - 08:00 | 0 | 0 | 0 | 0 |
| 24.11.2018 08:00 - 09:00 | 0 | 0 | 0 | 0 |
| 24.11.2018 09:00 - 10:00 | 0 | 0 | 0 | 0 |
| 24.11.2018 10:00 - 11:00 | 0 | 0 | 0 | 0 |
| 24.11.2018 11:00 - 12:00 | 0 | 0 | 0 | 0 |
| 24.11.2018 12:00 - 13:00 | 0 | 0 | 0 | 0 |
| 24.11.2018 13:00 - 14:00 | 0 | 0 | 0 | 0 |
| 24.11.2018 14:00 - 15:00 | 0 | 0 | 0 | 0 |
| 24.11.2018 15:00 - 16:00 | 0 | 0 | 0 | 0 |
| 24.11.2018 16:00 - 17:00 | 0 | 0 | 0 | 0 |
| 24.11.2018 17:00 - 18:00 | 0 | 0 | 0 | 0 |
| 24.11.2018 18:00 - 19:00 | 0 | 0 | 0 | 0 |
| 24.11.2018 19:00 - 20:00 | 0 | 0 | 0 | 0 |
| 24.11.2018 20:00 - 21:00 | 0 | 0 | 0 | 0 |
| 24.11.2018 21:00 - 22:00 | 0 | 0 | 0 | 0 |
| 24.11.2018 22:00 - 23:00 | 0 | 0 | 0 | 0 |
| 24.11.2018 23:00 - 24:00 | 0 | 0 | 0 | 0 |
| 25.11.2018 00:00 - 01:00 | 0 | 0 | 0 | 0 |
| 25.11.2018 01:00 - 02:00 | 0 | -200 | 0 | 0 |
| 25.11.2018 02:00 - 03:00 | 0 | -200 | 0 | 0 |
| 25.11.2018 03:00 - 04:00 | 0 | -200 | 0 | 0 |
| 25.11.2018 04:00 - 05:00 | 0 | -200 | 0 | 0 |
| 25.11.2018 05:00 - 06:00 | 0 | -200 | 0 | 0 |
| 25.11.2018 06:00 - 07:00 | 0 | 0 | 0 | 0 |
| 25.11.2018 07:00 - 08:00 | 0 | 0 | 0 | 0 |
| 25.11.2018 08:00 - 09:00 | 0 | 0 | 0 | 0 |
| 25.11.2018 09:00 - 10:00 | 0 | 0 | 0 | 0 |
| 25.11.2018 10:00 - 11:00 | 0 | 0 | 0 | 0 |
| 25.11.2018 11:00 - 12:00 | 0 | 0 | 0 | 0 |
| 25.11.2018 12:00 - 13:00 | 0 | 0 | 0 | 0 |
| 25.11.2018 13:00 - 14:00 | 0 | 0 | 0 | 0 |
| 25.11.2018 14:00 - 15:00 | 0 | 0 | 0 | 0 |
| 25.11.2018 15:00 - 16:00 | 0 | 0 | 0 | 0 |
| 25.11.2018 16:00 - 17:00 | 0 | 0 | 0 | 0 |
| 25.11.2018 17:00 - 18:00 | 0 | 0 | 0 | 0 |
| 25.11.2018 18:00 - 19:00 | 0 | 0 | 0 | 0 |
| 25.11.2018 19:00 - 20:00 | 0 | 0 | 0 | 0 |
| 25.11.2018 20:00 - 21:00 | 0 | 0 | 0 | 0 |
| 25.11.2018 21:00 - 22:00 | 0 | 0 | 0 | 0 |
| 25.11.2018 22:00 - 23:00 | 0 | 0 | 0 | 0 |
| 25.11.2018 23:00 - 24:00 | 0 | 0 | 0 | 0 |
| 26.11.2018 00:00 - 01:00 | 0 | 0 | 0 | 0 |
| 26.11.2018 01:00 - 02:00 | 0 | 0 | 0 | 0 |
| 26.11.2018 02:00 - 03:00 | 0 | 0 | 0 | 0 |
| 26.11.2018 03:00 - 04:00 | 0 | 0 | 0 | 0 |
| 26.11.2018 04:00 - 05:00 | 0 | 0 | 0 | 0 |
| 26.11.2018 05:00 - 06:00 | 0 | 0 | 0 | 0 |
| 26.11.2018 06:00 - 07:00 | 0 | 0 | 0 | 0 |
| 26.11.2018 07:00 - 08:00 | 0 | 0 | 0 | 0 |
| 26.11.2018 08:00 - 09:00 | 0 | 0 | 0 | 0 |
| 26.11.2018 09:00 - 10:00 | 0 | 0 | 0 | 0 |
| 26.11.2018 10:00 - 11:00 | 0 | 0 | 0 | 0 |
| 26.11.2018 11:00 - 12:00 | 0 | 0 | 0 | 0 |
| 26.11.2018 12:00 - 13:00 | 0 | 0 | 0 | 0 |
| 26.11.2018 13:00 - 14:00 | 0 | 0 | 0 | 0 |
| 26.11.2018 14:00 - 15:00 | 0 | 0 | 0 | 0 |
| 26.11.2018 15:00 - 16:00 | 0 | 0 | 0 | 0 |
| 26.11.2018 16:00 - 17:00 | 0 | 0 | 0 | 0 |
| 26.11.2018 17:00 - 18:00 | 0 | 0 | 0 | 0 |
| 26.11.2018 18:00 - 19:00 | 0 | 0 | 0 | 0 |
| 26.11.2018 19:00 - 20:00 | 0 | 0 | 0 | 0 |
| 26.11.2018 20:00 - 21:00 | 0 | 0 | 0 | 0 |
| 26.11.2018 21:00 - 22:00 | 0 | 0 | 0 | 0 |
| 26.11.2018 22:00 - 23:00 | 0 | 0 | 0 | 0 |
| 26.11.2018 23:00 - 24:00 | 0 | 0 | 0 | 0 |
| 27.11.2018 00:00 - 01:00 | 0 | 0 | 0 | 0 |
| 27.11.2018 01:00 - 02:00 | 0 | 0 | 0 | 0 |
| 27.11.2018 02:00 - 03:00 | 0 | 0 | 0 | 0 |
| 27.11.2018 03:00 - 04:00 | 0 | 0 | 0 | 0 |
| 27.11.2018 04:00 - 05:00 | 0 | 0 | 0 | 0 |
| 27.11.2018 05:00 - 06:00 | 0 | 0 | 0 | 0 |
| 27.11.2018 06:00 - 07:00 | 0 | 0 | 0 | 0 |
| 27.11.2018 07:00 - 08:00 | 0 | 0 | 0 | 0 |
| 27.11.2018 08:00 - 09:00 | 0 | 0 | 0 | 0 |
| 27.11.2018 09:00 - 10:00 | 0 | 0 | 0 | 0 |
| 27.11.2018 10:00 - 11:00 | 0 | 0 | 0 | 0 |
| 27.11.2018 11:00 - 12:00 | 0 | 0 | 0 | 0 |
| 27.11.2018 12:00 - 13:00 | 0 | 0 | 0 | 0 |
| 27.11.2018 13:00 - 14:00 | 0 | 0 | 0 | 0 |
| 27.11.2018 14:00 - 15:00 | 0 | 0 | 0 | 0 |
| 27.11.2018 15:00 - 16:00 | 0 | 0 | 0 | 0 |
| 27.11.2018 16:00 - 17:00 | 0 | 0 | 0 | 0 |
| 27.11.2018 17:00 - 18:00 | 0 | 0 | 0 | 0 |
| 27.11.2018 18:00 - 19:00 | 0 | 0 | 0 | 0 |
| 27.11.2018 19:00 - 20:00 | 0 | 0 | 0 | 0 |
| 27.11.2018 20:00 - 21:00 | 0 | 0 | 0 | 0 |
| 27.11.2018 21:00 - 22:00 | 0 | 0 | 0 | 0 |
| 27.11.2018 22:00 - 23:00 | 0 | 0 | 0 | 0 |
| 27.11.2018 23:00 - 24:00 | 0 | 0 | 0 | 0 |
| 28.11.2018 00:00 - 01:00 | 0 | 0 | 0 | 0 |
| 28.11.2018 01:00 - 02:00 | 0 | 0 | 0 | 0 |
| 28.11.2018 02:00 - 03:00 | 0 | -50 | 0 | 0 |
| 28.11.2018 03:00 - 04:00 | 0 | -50 | 0 | 0 |
| 28.11.2018 04:00 - 05:00 | 0 | -50 | 0 | 0 |
| 28.11.2018 05:00 - 06:00 | 0 | -50 | 0 | 0 |
| 28.11.2018 06:00 - 07:00 | 0 | 0 | 0 | 0 |
| 28.11.2018 07:00 - 08:00 | 0 | 0 | 0 | 0 |
| 28.11.2018 08:00 - 09:00 | 0 | 0 | 0 | 0 |
| 28.11.2018 09:00 - 10:00 | 0 | 0 | 0 | 0 |
| 28.11.2018 10:00 - 11:00 | 0 | 0 | 0 | 0 |
| 28.11.2018 11:00 - 12:00 | 0 | 0 | 0 | 0 |
| 28.11.2018 12:00 - 13:00 | 0 | 0 | 0 | 0 |
| 28.11.2018 13:00 - 14:00 | 0 | 0 | 0 | 0 |
| 28.11.2018 14:00 - 15:00 | 0 | 0 | 0 | 0 |
| 28.11.2018 15:00 - 16:00 | 0 | 0 | 0 | 0 |
| 28.11.2018 16:00 - 17:00 | 0 | 0 | 0 | 0 |
| 28.11.2018 17:00 - 18:00 | 0 | 0 | 0 | 0 |
| 28.11.2018 18:00 - 19:00 | 0 | 0 | 0 | 0 |
| 28.11.2018 19:00 - 20:00 | 0 | 0 | 0 | 0 |
| 28.11.2018 20:00 - 21:00 | 0 | 0 | 0 | 0 |
| 28.11.2018 21:00 - 22:00 | 0 | 0 | 0 | 0 |
| 28.11.2018 22:00 - 23:00 | 0 | 0 | 0 | 0 |
| 28.11.2018 23:00 - 24:00 | 0 | 0 | 0 | 0 |
| 29.11.2018 00:00 - 01:00 | 0 | 0 | 0 | 0 |
| 29.11.2018 01:00 - 02:00 | 0 | -70 | 0 | 0 |
| 29.11.2018 02:00 - 03:00 | 0 | -70 | 0 | 0 |
| 29.11.2018 03:00 - 04:00 | 0 | -70 | 0 | 0 |
| 29.11.2018 04:00 - 05:00 | 0 | -70 | 0 | 0 |
| 29.11.2018 05:00 - 06:00 | 0 | -70 | 0 | 0 |
| 29.11.2018 06:00 - 07:00 | 0 | 0 | 0 | 0 |
| 29.11.2018 07:00 - 08:00 | 0 | 0 | 0 | 0 |
| 29.11.2018 08:00 - 09:00 | 0 | 0 | 0 | 0 |
| 29.11.2018 09:00 - 10:00 | 0 | 0 | 0 | 0 |
| 29.11.2018 10:00 - 11:00 | 0 | 0 | 0 | 0 |
| 29.11.2018 11:00 - 12:00 | 0 | 0 | 0 | 0 |
| 29.11.2018 12:00 - 13:00 | 0 | 0 | 0 | 0 |
| 29.11.2018 13:00 - 14:00 | 0 | 0 | 0 | 0 |
| 29.11.2018 14:00 - 15:00 | 0 | 0 | 0 | 0 |
| 29.11.2018 15:00 - 16:00 | 0 | 0 | 0 | 0 |
| 29.11.2018 16:00 - 17:00 | 0 | 0 | 0 | 0 |
| 29.11.2018 17:00 - 18:00 | 0 | 0 | 0 | 0 |
| 29.11.2018 18:00 - 19:00 | 0 | 0 | 0 | 0 |
| 29.11.2018 19:00 - 20:00 | 0 | 0 | 0 | 0 |
| 29.11.2018 20:00 - 21:00 | 0 | 0 | 0 | 0 |
| 29.11.2018 21:00 - 22:00 | 0 | 0 | 0 | 0 |
| 29.11.2018 22:00 - 23:00 | 0 | 0 | 0 | 0 |
| 29.11.2018 23:00 - 24:00 | 0 | 0 | 0 | 0 |
| 30.11.2018 00:00 - 01:00 | 0 | -40 | 0 | 0 |
| 30.11.2018 01:00 - 02:00 | 0 | -40 | 0 | 0 |
| 30.11.2018 02:00 - 03:00 | 0 | -40 | 0 | 0 |
| 30.11.2018 03:00 - 04:00 | 0 | -40 | 0 | 0 |
| 30.11.2018 04:00 - 05:00 | 0 | -40 | 0 | 0 |
| 30.11.2018 05:00 - 06:00 | 0 | -40 | 0 | 0 |
| 30.11.2018 06:00 - 07:00 | 0 | 0 | 0 | 0 |
| 30.11.2018 07:00 - 08:00 | 0 | 0 | 0 | 0 |
| 30.11.2018 08:00 - 09:00 | 0 | 0 | 0 | 0 |
| 30.11.2018 09:00 - 10:00 | 0 | 0 | 0 | 0 |
| 30.11.2018 10:00 - 11:00 | 0 | 0 | 0 | 0 |
| 30.11.2018 11:00 - 12:00 | 0 | 0 | 0 | 0 |